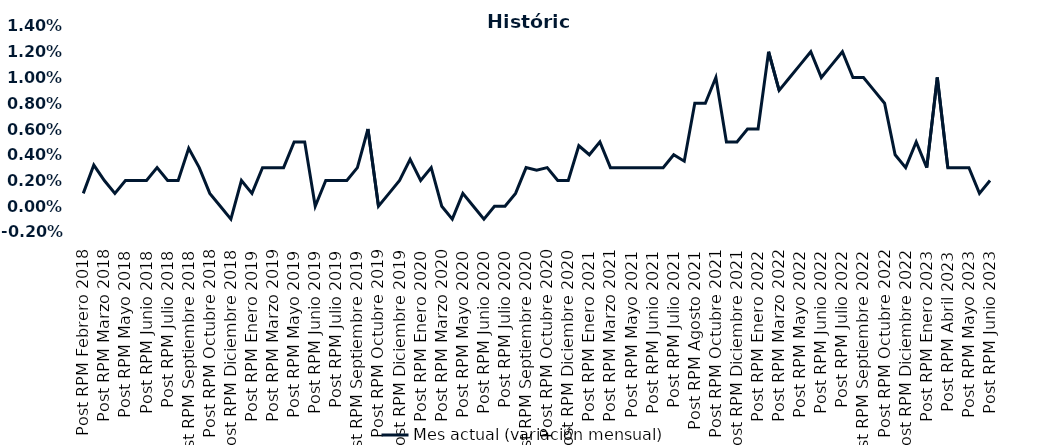
| Category | Mes actual (variación mensual)  |
|---|---|
| Post RPM Febrero 2018 | 0.001 |
| Pre RPM Marzo 2018 | 0.003 |
| Post RPM Marzo 2018 | 0.002 |
| Pre RPM Mayo 2018 | 0.001 |
| Post RPM Mayo 2018 | 0.002 |
| Pre RPM Junio 2018 | 0.002 |
| Post RPM Junio 2018 | 0.002 |
| Pre RPM Julio 2018 | 0.003 |
| Post RPM Julio 2018 | 0.002 |
| Pre RPM Septiembre 2018 | 0.002 |
| Post RPM Septiembre 2018 | 0.004 |
| Pre RPM Octubre 2018 | 0.003 |
| Post RPM Octubre 2018 | 0.001 |
| Pre RPM Diciembre 2018 | 0 |
| Post RPM Diciembre 2018 | -0.001 |
| Pre RPM Enero 2019 | 0.002 |
| Post RPM Enero 2019 | 0.001 |
| Pre RPM Marzo 2019 | 0.003 |
| Post RPM Marzo 2019 | 0.003 |
| Pre RPM Mayo 2019 | 0.003 |
| Post RPM Mayo 2019 | 0.005 |
| Pre RPM Junio 2019 | 0.005 |
| Post RPM Junio 2019 | 0 |
| Pre RPM Julio 2019 | 0.002 |
| Post RPM Julio 2019 | 0.002 |
| Pre RPM Septiembre 2019 | 0.002 |
| Post RPM Septiembre 2019 | 0.003 |
| Pre RPM Octubre 2019 | 0.006 |
| Post RPM Octubre 2019 | 0 |
| Pre RPM Diciembre 2019 | 0.001 |
| Post RPM Diciembre 2019 | 0.002 |
| Pre RPM Enero 2020 | 0.004 |
| Post RPM Enero 2020 | 0.002 |
| Pre RPM Marzo 2020 | 0.003 |
| Post RPM Marzo 2020 | 0 |
| Pre RPM Mayo 2020 | -0.001 |
| Post RPM Mayo 2020 | 0.001 |
| Pre RPM Junio 2020 | 0 |
| Post RPM Junio 2020 | -0.001 |
| Pre RPM Julio 2020 | 0 |
| Post RPM Julio 2020 | 0 |
| Pre RPM Septiembre 2020 | 0.001 |
| Post RPM Septiembre 2020 | 0.003 |
| Pre RPM Octubre 2020 | 0.003 |
| Post RPM Octubre 2020 | 0.003 |
| Pre RPM Diciembre 2020 | 0.002 |
| Post RPM Diciembre 2020 | 0.002 |
| Pre RPM Enero 2021 | 0.005 |
| Post RPM Enero 2021 | 0.004 |
| Pre RPM Marzo 2021 | 0.005 |
| Post RPM Marzo 2021 | 0.003 |
| Pre RPM Mayo 2021 | 0.003 |
| Post RPM Mayo 2021 | 0.003 |
| Pre RPM Junio 2021 | 0.003 |
| Post RPM Junio 2021 | 0.003 |
| Pre RPM Julio 2021 | 0.003 |
| Post RPM Julio 2021 | 0.004 |
| Pre RPM Agosto 2021 | 0.004 |
| Post RPM Agosto 2021 | 0.008 |
| Pre RPM Octubre 2021 | 0.008 |
| Post RPM Octubre 2021 | 0.01 |
| Pre RPM Diciembre 2021 | 0.005 |
| Post RPM Diciembre 2021 | 0.005 |
| Pre RPM Enero 2022 | 0.006 |
| Post RPM Enero 2022 | 0.006 |
| Pre RPM Marzo 2022 | 0.012 |
| Post RPM Marzo 2022 | 0.009 |
| Pre RPM Mayo 2022 | 0.01 |
| Post RPM Mayo 2022 | 0.011 |
| Pre RPM Junio 2022 | 0.012 |
| Post RPM Junio 2022 | 0.01 |
| Pre RPM Julio 2022 | 0.011 |
| Post RPM Julio 2022 | 0.012 |
| Pre RPM Septiembre 2022 | 0.01 |
| Post RPM Septiembre 2022 | 0.01 |
| Pre RPM Octubre 2022 | 0.009 |
| Post RPM Octubre 2022 | 0.008 |
| Pre RPM Diciembre 2022 | 0.004 |
| Post RPM Diciembre 2022 | 0.003 |
| Pre RPM Enero 2023 | 0.005 |
| Post RPM Enero 2023 | 0.003 |
| Pre RPM Abril 2023 | 0.01 |
| Post RPM Abril 2023 | 0.003 |
| Pre RPM Mayo 2023 | 0.003 |
| Post RPM Mayo 2023 | 0.003 |
| Pre RPM Junio 2023 | 0.001 |
| Post RPM Junio 2023 | 0.002 |